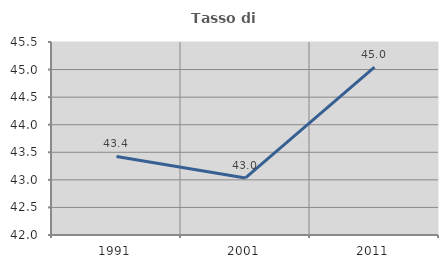
| Category | Tasso di occupazione   |
|---|---|
| 1991.0 | 43.425 |
| 2001.0 | 43.035 |
| 2011.0 | 45.045 |